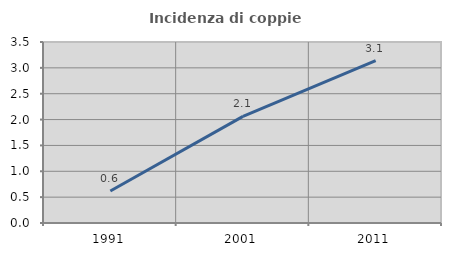
| Category | Incidenza di coppie miste |
|---|---|
| 1991.0 | 0.619 |
| 2001.0 | 2.062 |
| 2011.0 | 3.142 |